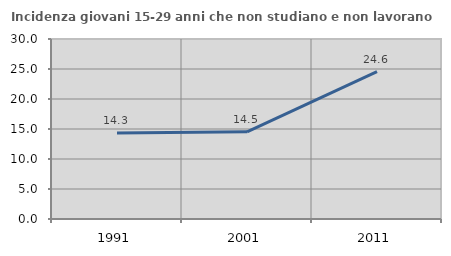
| Category | Incidenza giovani 15-29 anni che non studiano e non lavorano  |
|---|---|
| 1991.0 | 14.343 |
| 2001.0 | 14.523 |
| 2011.0 | 24.561 |